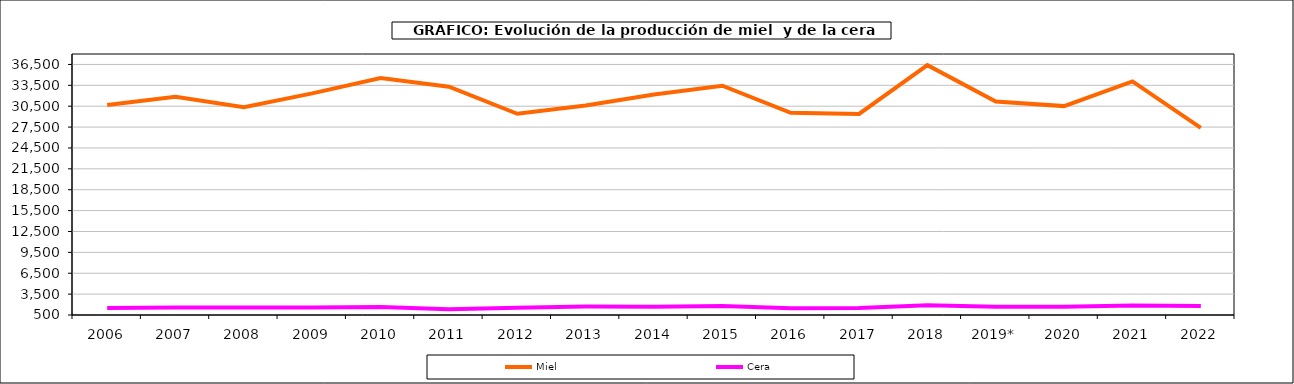
| Category | Miel | Cera |
|---|---|---|
| 2006 | 30661.002 | 1522.368 |
| 2007 | 31840.043 | 1567.556 |
| 2008 | 30361.319 | 1574.535 |
| 2009 | 32336.448 | 1577.669 |
| 2010 | 34550 | 1649 |
| 2011 | 33298.2 | 1325.9 |
| 2012 | 29405 | 1533.9 |
| 2013 | 30612.761 | 1711.558 |
| 2014 | 32174.268 | 1688.302 |
| 2015 | 33440.771 | 1801.65 |
| 2016 | 29545.284 | 1472.699 |
| 2017 | 29393.153 | 1519.363 |
| 2018 | 36393.995 | 1903.773 |
| 2019* | 31160.769 | 1673.824 |
| 2020 | 30512.727 | 1687.065 |
| 2021 | 34064.819 | 1853.906 |
| 2022 | 27393.976 | 1779.921 |